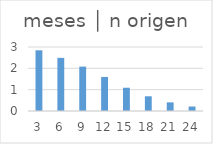
| Category | meses │ n origen |
|---|---|
| 3.0 | 2.845 |
| 6.0 | 2.49 |
| 9.0 | 2.081 |
| 12.0 | 1.596 |
| 15.0 | 1.091 |
| 18.0 | 0.689 |
| 21.0 | 0.405 |
| 24.0 | 0.209 |